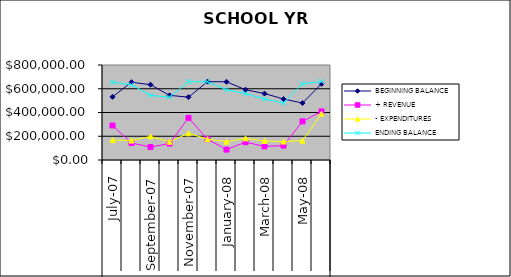
| Category | BEGINNING BALANCE | + REVENUE | - EXPENDITURES | ENDING BALANCE |
|---|---|---|---|---|
| 0 | 531983.56 | 290761.1 | 167727.38 | 655017.28 |
| 1 | 655017.28 | 142782.93 | 163732.45 | 634067.76 |
| 2 | 634067.76 | 108847.9 | 198436.5 | 544479.16 |
| 3 | 544479.16 | 138533.05 | 153959.68 | 529052.53 |
| 4 | 529052.53 | 354743.92 | 224533.05 | 659263.4 |
| 5 | 659263.4 | 174964.52 | 175650.19 | 658577.73 |
| 6 | 658577.73 | 87473.09 | 154361.89 | 591688.93 |
| 7 | 591688.93 | 150356.81 | 182345.84 | 559699.9 |
| 8 | 559699.9 | 114663.39 | 160865.34 | 513497.95 |
| 9 | 513497.95 | 121244.72 | 155100.85 | 479641.82 |
| 10 | 479641.82 | 325018.96 | 162824.55 | 641836.23 |
| 11 | 641836.23 | 409310.46 | 390321.03 | 660825.66 |